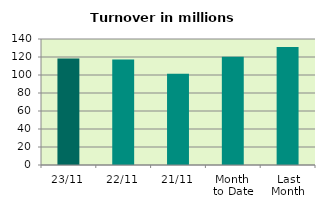
| Category | Series 0 |
|---|---|
| 23/11 | 118.455 |
| 22/11 | 117.25 |
| 21/11 | 101.499 |
| Month 
to Date | 120.327 |
| Last
Month | 131.017 |